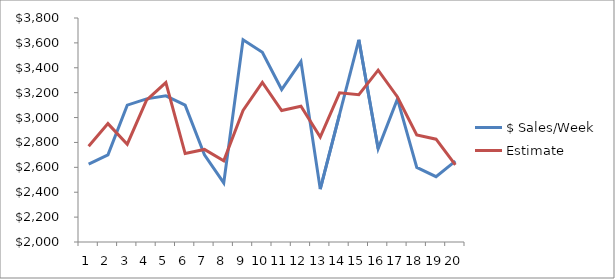
| Category | $ Sales/Week | Estimate |
|---|---|---|
| 0 | 2625 | 2769.378 |
| 1 | 2700 | 2951.384 |
| 2 | 3100 | 2785.818 |
| 3 | 3150 | 3140.052 |
| 4 | 3175 | 3281.348 |
| 5 | 3100 | 2710.671 |
| 6 | 2700 | 2743.94 |
| 7 | 2475 | 2652.353 |
| 8 | 3625 | 3057.853 |
| 9 | 3525 | 3281.737 |
| 10 | 3225 | 3056.686 |
| 11 | 3450 | 3091.511 |
| 12 | 2425 | 2842.968 |
| 13 | 3025 | 3198.759 |
| 14 | 3625 | 3183.098 |
| 15 | 2750 | 3380.765 |
| 16 | 3150 | 3165.49 |
| 17 | 2600 | 2860.575 |
| 18 | 2525 | 2826.139 |
| 19 | 2650 | 2619.474 |